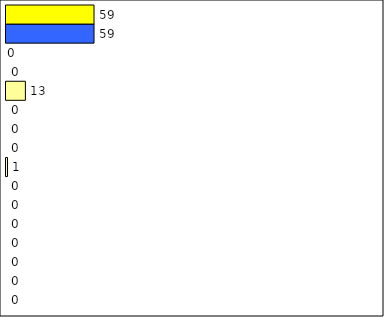
| Category | -2 | -1 | 0 | 1 | 2 | 3 | 4 | 5 | 6 | 7 | 8 | 9 | 10 | 11 | 12 | Perfect Round |
|---|---|---|---|---|---|---|---|---|---|---|---|---|---|---|---|---|
| 0 | 0 | 0 | 0 | 0 | 0 | 0 | 0 | 1 | 0 | 0 | 0 | 13 | 0 | 0 | 59 | 59 |